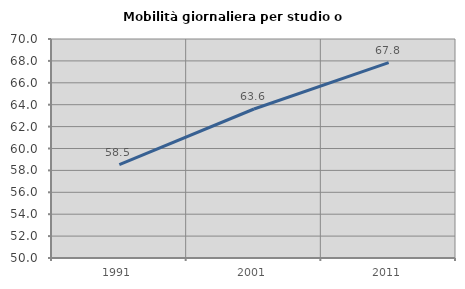
| Category | Mobilità giornaliera per studio o lavoro |
|---|---|
| 1991.0 | 58.537 |
| 2001.0 | 63.607 |
| 2011.0 | 67.84 |